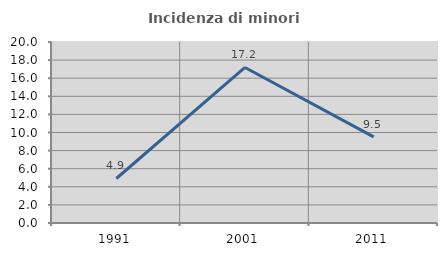
| Category | Incidenza di minori stranieri |
|---|---|
| 1991.0 | 4.918 |
| 2001.0 | 17.188 |
| 2011.0 | 9.524 |